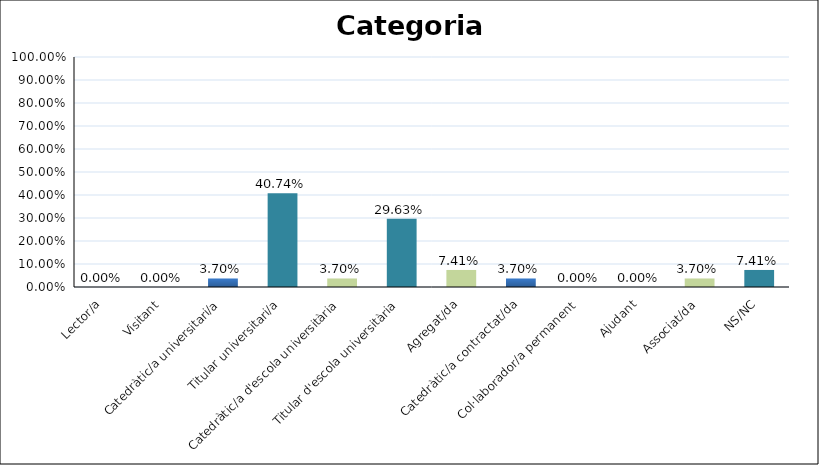
| Category | Series 0 |
|---|---|
| Lector/a | 0 |
| Visitant | 0 |
| Catedràtic/a universitari/a | 0.037 |
| Titular universitari/a | 0.407 |
| Catedràtic/a d'escola universitària | 0.037 |
| Titular d'escola universitària | 0.296 |
| Agregat/da | 0.074 |
| Catedràtic/a contractat/da | 0.037 |
| Col·laborador/a permanent | 0 |
| Ajudant | 0 |
| Associat/da | 0.037 |
| NS/NC | 0.074 |